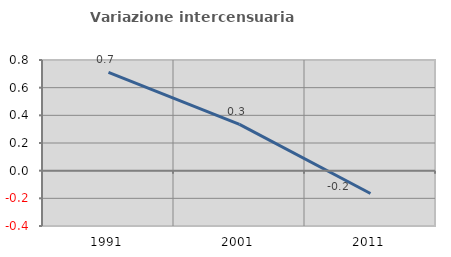
| Category | Variazione intercensuaria annua |
|---|---|
| 1991.0 | 0.711 |
| 2001.0 | 0.334 |
| 2011.0 | -0.165 |